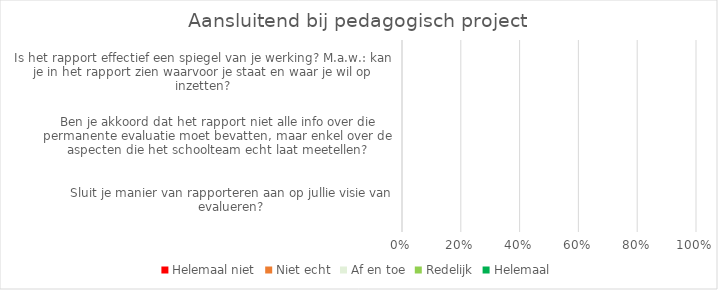
| Category | Helemaal niet | Niet echt | Af en toe | Redelijk | Helemaal |
|---|---|---|---|---|---|
| Sluit je manier van rapporteren aan op jullie visie van evalueren? | 0 | 0 | 0 | 0 | 0 |
| Ben je akkoord dat het rapport niet alle info over die permanente evaluatie moet bevatten, maar enkel over de aspecten die het schoolteam echt laat meetellen? | 0 | 0 | 0 | 0 | 0 |
| Is het rapport effectief een spiegel van je werking? M.a.w.: kan je in het rapport zien waarvoor je staat en waar je wil op inzetten? | 0 | 0 | 0 | 0 | 0 |